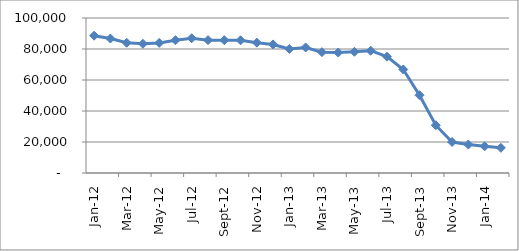
| Category | Series 0 |
|---|---|
| 2012-01-01 | 88601 |
| 2012-02-01 | 86741 |
| 2012-03-01 | 84017 |
| 2012-04-01 | 83376 |
| 2012-05-01 | 83945 |
| 2012-06-01 | 85671 |
| 2012-07-01 | 86942 |
| 2012-08-01 | 85723 |
| 2012-09-01 | 85690 |
| 2012-10-01 | 85608 |
| 2012-11-01 | 84083 |
| 2012-12-01 | 82943 |
| 2013-01-01 | 80027 |
| 2013-02-01 | 80994 |
| 2013-03-01 | 77967 |
| 2013-04-01 | 77730 |
| 2013-05-01 | 78206 |
| 2013-06-01 | 78893 |
| 2013-07-01 | 75060 |
| 2013-08-01 | 66781 |
| 2013-09-01 | 50204 |
| 2013-10-01 | 30828 |
| 2013-11-01 | 20003 |
| 2013-12-01 | 18346 |
| 2014-01-01 | 17214 |
| 2014-02-01 | 16233 |